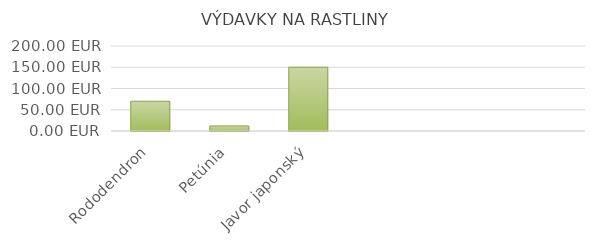
| Category | Rododendron |
|---|---|
| Rododendron | 70 |
| Petúnia | 11.94 |
| Javor japonský | 150 |